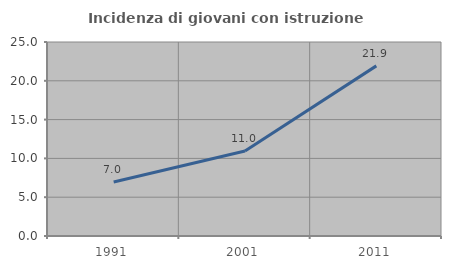
| Category | Incidenza di giovani con istruzione universitaria |
|---|---|
| 1991.0 | 6.951 |
| 2001.0 | 10.962 |
| 2011.0 | 21.924 |